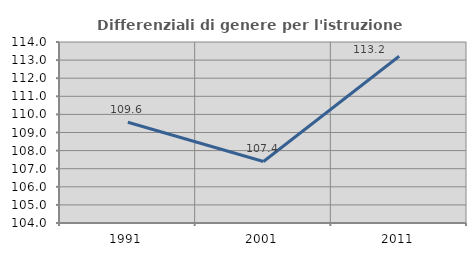
| Category | Differenziali di genere per l'istruzione superiore |
|---|---|
| 1991.0 | 109.569 |
| 2001.0 | 107.4 |
| 2011.0 | 113.212 |